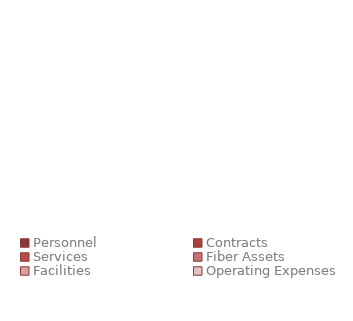
| Category | $0.00  |
|---|---|
| Personnel | 0 |
| Contracts | 0 |
| Services | 0 |
| Fiber Assets | 0 |
| Facilities | 0 |
| Operating Expenses | 0 |